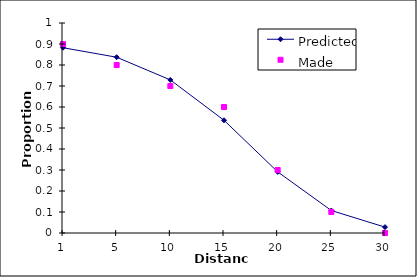
| Category | Predicted | Made |
|---|---|---|
| 1.0 | 0.882 | 0.9 |
| 5.0 | 0.837 | 0.8 |
| 10.0 | 0.729 | 0.7 |
| 15.0 | 0.537 | 0.6 |
| 20.0 | 0.291 | 0.3 |
| 25.0 | 0.107 | 0.1 |
| 30.0 | 0.028 | 0 |